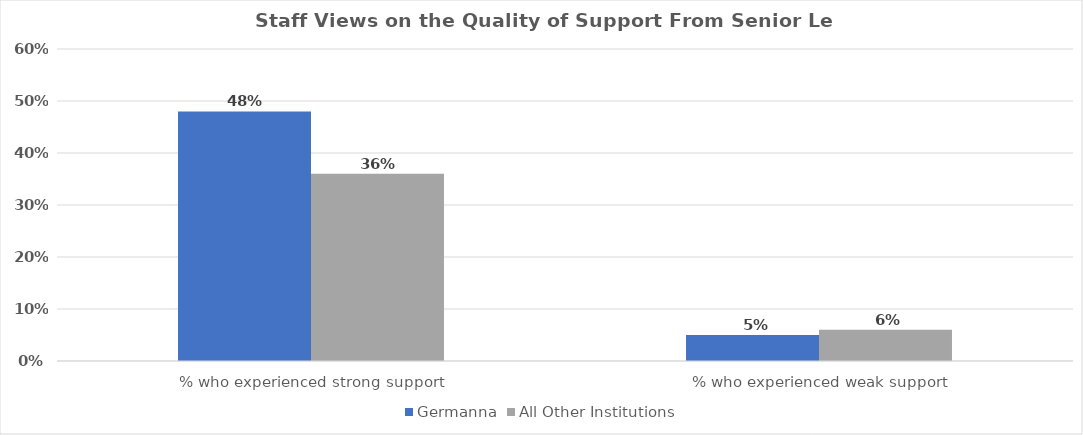
| Category | Germanna | All Other Institutions |
|---|---|---|
| % who experienced strong support | 0.48 | 0.36 |
| % who experienced weak support | 0.05 | 0.06 |